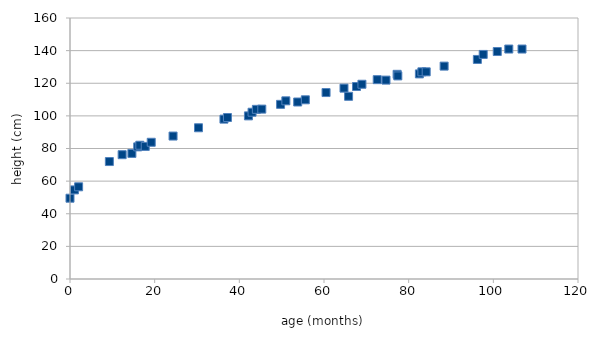
| Category | age (months) |
|---|---|
| 0.0 | 49.53 |
| 1.05133470225873 | 54.61 |
| 2.03696098562628 | 56.515 |
| 9.29774127310062 | 72 |
| 12.3203285420945 | 76.2 |
| 14.6201232032854 | 77 |
| 16.0 | 81 |
| 16.4928131416838 | 82 |
| 17.7741273100616 | 81.28 |
| 19.1868583162218 | 83.82 |
| 24.3449691991786 | 87.63 |
| 30.3572895277207 | 92.71 |
| 36.3696098562628 | 98 |
| 37.1909650924025 | 99 |
| 42.1519507186858 | 100 |
| 43.0061601642711 | 102.235 |
| 44.0246406570842 | 104 |
| 45.305954825462 | 104.14 |
| 49.741273100616 | 107.061 |
| 50.9897330595483 | 109.22 |
| 53.782340862423 | 108.5 |
| 55.5893223819302 | 109.855 |
| 60.4845995893224 | 114.3 |
| 64.7227926078029 | 117 |
| 65.8069815195072 | 112 |
| 67.6796714579055 | 118 |
| 68.9609856262834 | 119.38 |
| 72.5749486652977 | 122.199 |
| 74.6447638603696 | 121.92 |
| 77.2731006160164 | 125.476 |
| 77.4373716632443 | 124.5 |
| 82.5297741273101 | 125.73 |
| 83.1211498973306 | 127 |
| 84.1396303901437 | 127 |
| 88.3778234086242 | 130.5 |
| 96.2299794661191 | 134.595 |
| 97.6098562628337 | 137.668 |
| 100.928131416838 | 139.446 |
| 103.655030800821 | 140.97 |
| 106.776180698152 | 140.97 |